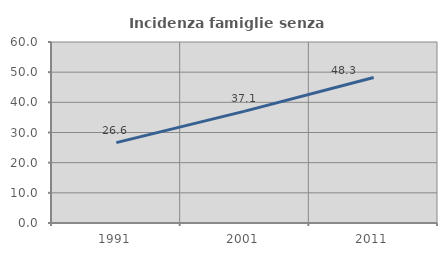
| Category | Incidenza famiglie senza nuclei |
|---|---|
| 1991.0 | 26.632 |
| 2001.0 | 37.097 |
| 2011.0 | 48.255 |